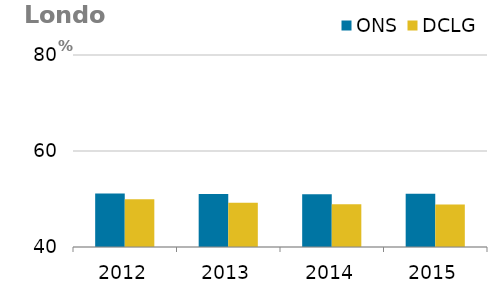
| Category | ONS | DCLG |
|---|---|---|
| 0 | 51.13 | 49.948 |
| 1 | 51.04 | 49.21 |
| 2 | 50.98 | 48.912 |
| 3 | 51.09 | 48.839 |